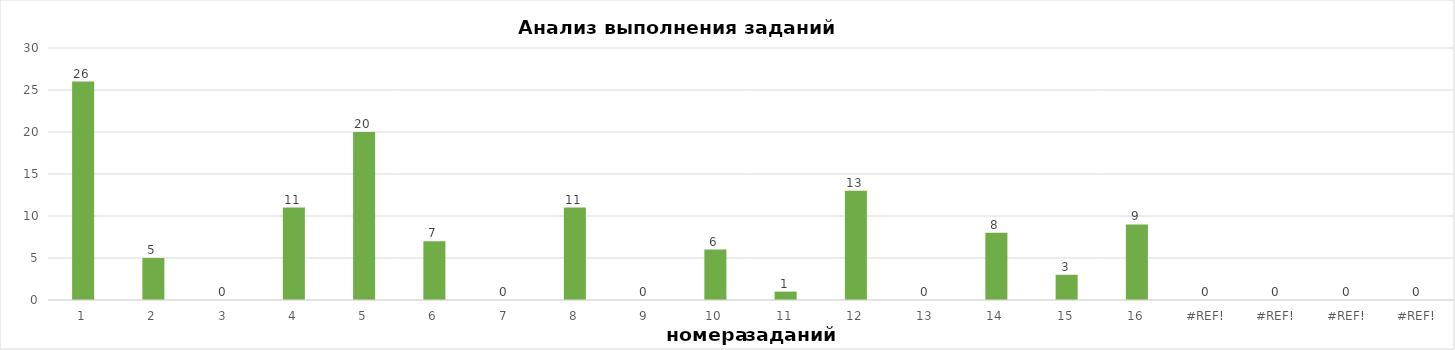
| Category | задания |
|---|---|
| 1.0 | 26 |
| 2.0 | 5 |
| 3.0 | 0 |
| 4.0 | 11 |
| 5.0 | 20 |
| 6.0 | 7 |
| 7.0 | 0 |
| 8.0 | 11 |
| 9.0 | 0 |
| 10.0 | 6 |
| 11.0 | 1 |
| 12.0 | 13 |
| 13.0 | 0 |
| 14.0 | 8 |
| 15.0 | 3 |
| 16.0 | 9 |
| 0.0 | 0 |
| 0.0 | 0 |
| 0.0 | 0 |
| 0.0 | 0 |